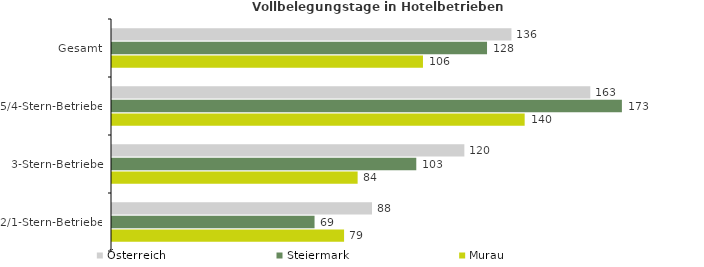
| Category | Österreich | Steiermark | Murau |
|---|---|---|---|
| Gesamt | 135.866 | 127.561 | 105.772 |
| 5/4-Stern-Betriebe | 162.683 | 173.435 | 140.363 |
| 3-Stern-Betriebe | 119.851 | 103.499 | 83.545 |
| 2/1-Stern-Betriebe | 88.435 | 68.894 | 78.939 |